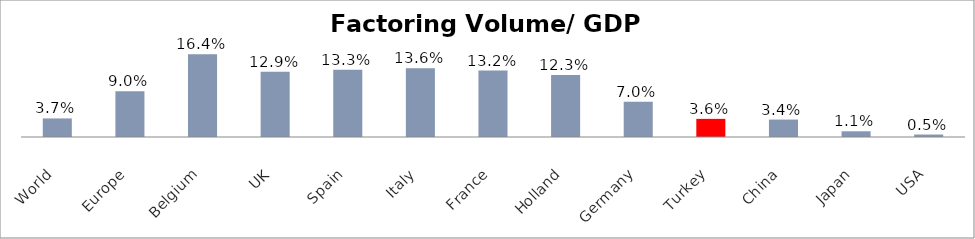
| Category | Factoring Volume/ GDP (%) |
|---|---|
| World | 0.037 |
| Europe | 0.09 |
| Belgium | 0.164 |
| UK | 0.129 |
| Spain | 0.133 |
| Italy | 0.136 |
| France | 0.132 |
| Holland | 0.123 |
| Germany | 0.07 |
| Turkey | 0.036 |
| China | 0.034 |
| Japan | 0.011 |
| USA | 0.005 |